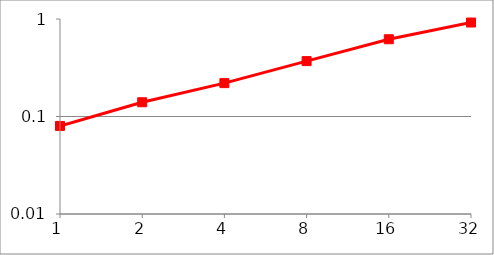
| Category | Series 0 |
|---|---|
| 1.0 | 0.08 |
| 2.0 | 0.14 |
| 4.0 | 0.22 |
| 8.0 | 0.37 |
| 16.0 | 0.62 |
| 32.0 | 0.92 |